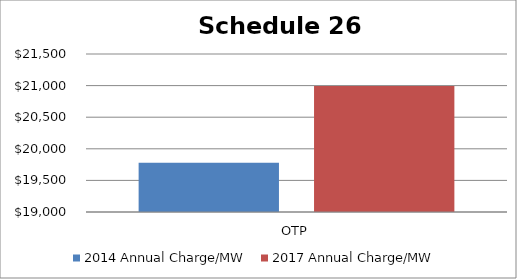
| Category | 2014 Annual Charge/MW | 2017 Annual Charge/MW |
|---|---|---|
| OTP | 19778.863 | 20992.731 |